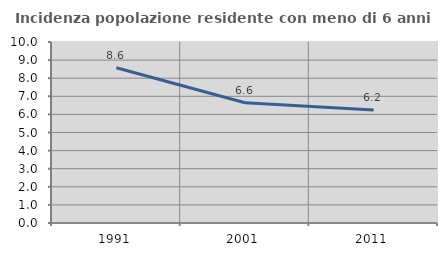
| Category | Incidenza popolazione residente con meno di 6 anni |
|---|---|
| 1991.0 | 8.58 |
| 2001.0 | 6.645 |
| 2011.0 | 6.24 |